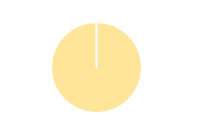
| Category | Total | Series 1 |
|---|---|---|
| Y | 0 | 0 |
| R | 0 | 0 |
| T | 0 | 0 |
| M | 0 | 0 |
| F | 0 | 0 |
| N | 27 | 27 |